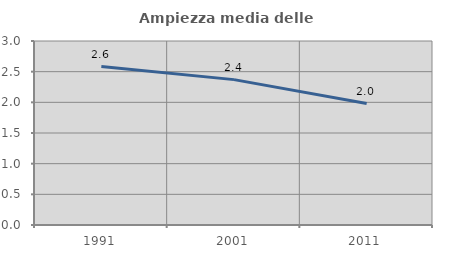
| Category | Ampiezza media delle famiglie |
|---|---|
| 1991.0 | 2.583 |
| 2001.0 | 2.37 |
| 2011.0 | 1.98 |